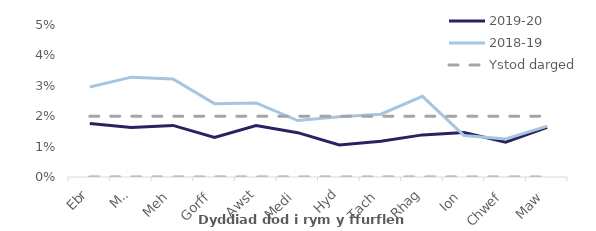
| Category | 2019-20 | 2018-19 | Ystod darged | Affin uchaf |
|---|---|---|---|---|
| Ebr | 0.018 | 0.03 | 0 | 0.02 |
| Mai | 0.016 | 0.033 | 0 | 0.02 |
| Meh | 0.017 | 0.032 | 0 | 0.02 |
| Gorff | 0.013 | 0.024 | 0 | 0.02 |
| Awst | 0.017 | 0.024 | 0 | 0.02 |
| Medi | 0.015 | 0.019 | 0 | 0.02 |
| Hyd | 0.011 | 0.02 | 0 | 0.02 |
| Tach | 0.012 | 0.021 | 0 | 0.02 |
| Rhag | 0.014 | 0.027 | 0 | 0.02 |
| Ion | 0.015 | 0.014 | 0 | 0.02 |
| Chwef | 0.011 | 0.012 | 0 | 0.02 |
| Maw | 0.016 | 0.017 | 0 | 0.02 |